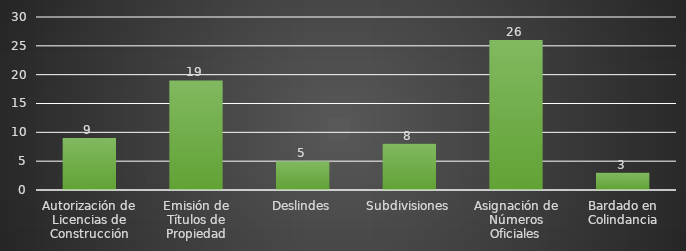
| Category | INDICADOR  |
|---|---|
| Autorización de Licencias de Construcción | 9 |
| Emisión de Títulos de Propiedad | 19 |
| Deslindes | 5 |
| Subdivisiones | 8 |
| Asignación de Números Oficiales | 26 |
| Bardado en Colindancia | 3 |